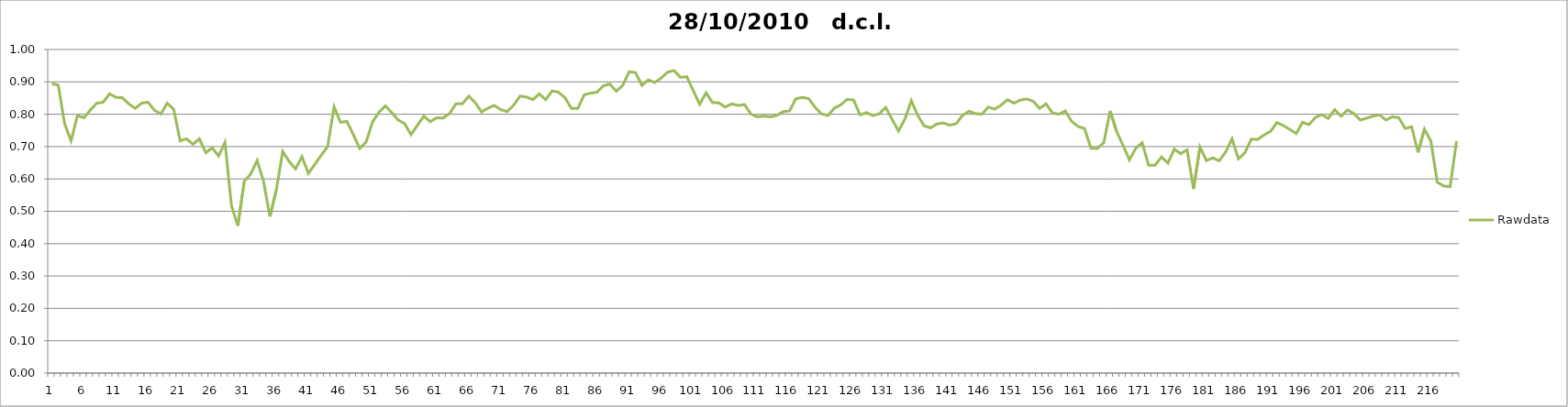
| Category | Rawdata |
|---|---|
| 0 | 0.894 |
| 1 | 0.89 |
| 2 | 0.77 |
| 3 | 0.718 |
| 4 | 0.796 |
| 5 | 0.789 |
| 6 | 0.813 |
| 7 | 0.834 |
| 8 | 0.837 |
| 9 | 0.863 |
| 10 | 0.852 |
| 11 | 0.851 |
| 12 | 0.832 |
| 13 | 0.818 |
| 14 | 0.834 |
| 15 | 0.837 |
| 16 | 0.812 |
| 17 | 0.801 |
| 18 | 0.834 |
| 19 | 0.815 |
| 20 | 0.718 |
| 21 | 0.724 |
| 22 | 0.707 |
| 23 | 0.724 |
| 24 | 0.681 |
| 25 | 0.696 |
| 26 | 0.671 |
| 27 | 0.713 |
| 28 | 0.518 |
| 29 | 0.455 |
| 30 | 0.593 |
| 31 | 0.615 |
| 32 | 0.657 |
| 33 | 0.593 |
| 34 | 0.484 |
| 35 | 0.566 |
| 36 | 0.685 |
| 37 | 0.654 |
| 38 | 0.631 |
| 39 | 0.669 |
| 40 | 0.617 |
| 41 | 0.645 |
| 42 | 0.673 |
| 43 | 0.7 |
| 44 | 0.823 |
| 45 | 0.775 |
| 46 | 0.778 |
| 47 | 0.737 |
| 48 | 0.694 |
| 49 | 0.714 |
| 50 | 0.776 |
| 51 | 0.806 |
| 52 | 0.826 |
| 53 | 0.805 |
| 54 | 0.782 |
| 55 | 0.771 |
| 56 | 0.737 |
| 57 | 0.766 |
| 58 | 0.794 |
| 59 | 0.777 |
| 60 | 0.789 |
| 61 | 0.788 |
| 62 | 0.802 |
| 63 | 0.832 |
| 64 | 0.832 |
| 65 | 0.856 |
| 66 | 0.836 |
| 67 | 0.807 |
| 68 | 0.819 |
| 69 | 0.827 |
| 70 | 0.814 |
| 71 | 0.808 |
| 72 | 0.828 |
| 73 | 0.856 |
| 74 | 0.853 |
| 75 | 0.845 |
| 76 | 0.863 |
| 77 | 0.845 |
| 78 | 0.872 |
| 79 | 0.868 |
| 80 | 0.851 |
| 81 | 0.818 |
| 82 | 0.818 |
| 83 | 0.86 |
| 84 | 0.865 |
| 85 | 0.868 |
| 86 | 0.888 |
| 87 | 0.893 |
| 88 | 0.871 |
| 89 | 0.889 |
| 90 | 0.931 |
| 91 | 0.929 |
| 92 | 0.889 |
| 93 | 0.906 |
| 94 | 0.898 |
| 95 | 0.912 |
| 96 | 0.93 |
| 97 | 0.935 |
| 98 | 0.914 |
| 99 | 0.916 |
| 100 | 0.873 |
| 101 | 0.831 |
| 102 | 0.866 |
| 103 | 0.836 |
| 104 | 0.835 |
| 105 | 0.822 |
| 106 | 0.832 |
| 107 | 0.827 |
| 108 | 0.83 |
| 109 | 0.8 |
| 110 | 0.792 |
| 111 | 0.794 |
| 112 | 0.792 |
| 113 | 0.796 |
| 114 | 0.808 |
| 115 | 0.81 |
| 116 | 0.848 |
| 117 | 0.852 |
| 118 | 0.848 |
| 119 | 0.821 |
| 120 | 0.801 |
| 121 | 0.796 |
| 122 | 0.819 |
| 123 | 0.829 |
| 124 | 0.846 |
| 125 | 0.844 |
| 126 | 0.798 |
| 127 | 0.805 |
| 128 | 0.796 |
| 129 | 0.801 |
| 130 | 0.821 |
| 131 | 0.784 |
| 132 | 0.748 |
| 133 | 0.785 |
| 134 | 0.842 |
| 135 | 0.796 |
| 136 | 0.764 |
| 137 | 0.758 |
| 138 | 0.77 |
| 139 | 0.773 |
| 140 | 0.766 |
| 141 | 0.771 |
| 142 | 0.797 |
| 143 | 0.809 |
| 144 | 0.802 |
| 145 | 0.8 |
| 146 | 0.822 |
| 147 | 0.816 |
| 148 | 0.828 |
| 149 | 0.845 |
| 150 | 0.834 |
| 151 | 0.844 |
| 152 | 0.847 |
| 153 | 0.84 |
| 154 | 0.818 |
| 155 | 0.832 |
| 156 | 0.804 |
| 157 | 0.8 |
| 158 | 0.81 |
| 159 | 0.778 |
| 160 | 0.762 |
| 161 | 0.756 |
| 162 | 0.695 |
| 163 | 0.694 |
| 164 | 0.712 |
| 165 | 0.81 |
| 166 | 0.747 |
| 167 | 0.704 |
| 168 | 0.659 |
| 169 | 0.695 |
| 170 | 0.712 |
| 171 | 0.642 |
| 172 | 0.642 |
| 173 | 0.668 |
| 174 | 0.649 |
| 175 | 0.692 |
| 176 | 0.678 |
| 177 | 0.69 |
| 178 | 0.569 |
| 179 | 0.699 |
| 180 | 0.657 |
| 181 | 0.665 |
| 182 | 0.656 |
| 183 | 0.683 |
| 184 | 0.724 |
| 185 | 0.662 |
| 186 | 0.681 |
| 187 | 0.723 |
| 188 | 0.722 |
| 189 | 0.736 |
| 190 | 0.747 |
| 191 | 0.774 |
| 192 | 0.765 |
| 193 | 0.753 |
| 194 | 0.74 |
| 195 | 0.775 |
| 196 | 0.768 |
| 197 | 0.79 |
| 198 | 0.799 |
| 199 | 0.787 |
| 200 | 0.814 |
| 201 | 0.794 |
| 202 | 0.813 |
| 203 | 0.802 |
| 204 | 0.782 |
| 205 | 0.788 |
| 206 | 0.794 |
| 207 | 0.798 |
| 208 | 0.782 |
| 209 | 0.792 |
| 210 | 0.789 |
| 211 | 0.756 |
| 212 | 0.761 |
| 213 | 0.682 |
| 214 | 0.754 |
| 215 | 0.717 |
| 216 | 0.59 |
| 217 | 0.578 |
| 218 | 0.576 |
| 219 | 0.717 |